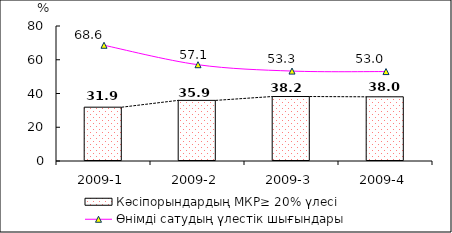
| Category | Кәсіпорындардың МКР≥ 20% үлесі |
|---|---|
| 2009-1 | 31.89 |
| 2009-2 | 35.93 |
| 2009-3 | 38.21 |
| 2009-4 | 38.04 |